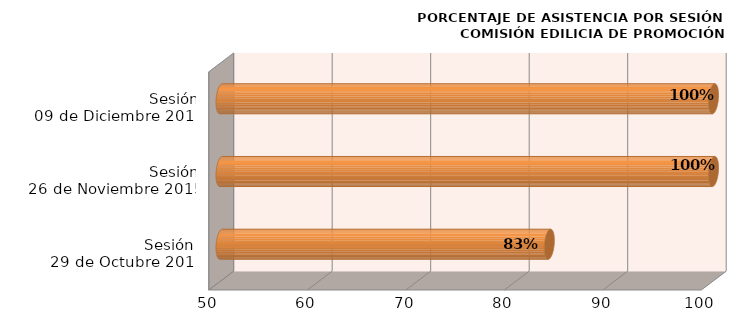
| Category | Series 0 |
|---|---|
| Sesión 
29 de Octubre 2015 | 83.333 |
| Sesión
26 de Noviembre 2015 | 100 |
| Sesión
09 de Diciembre 2015 | 100 |